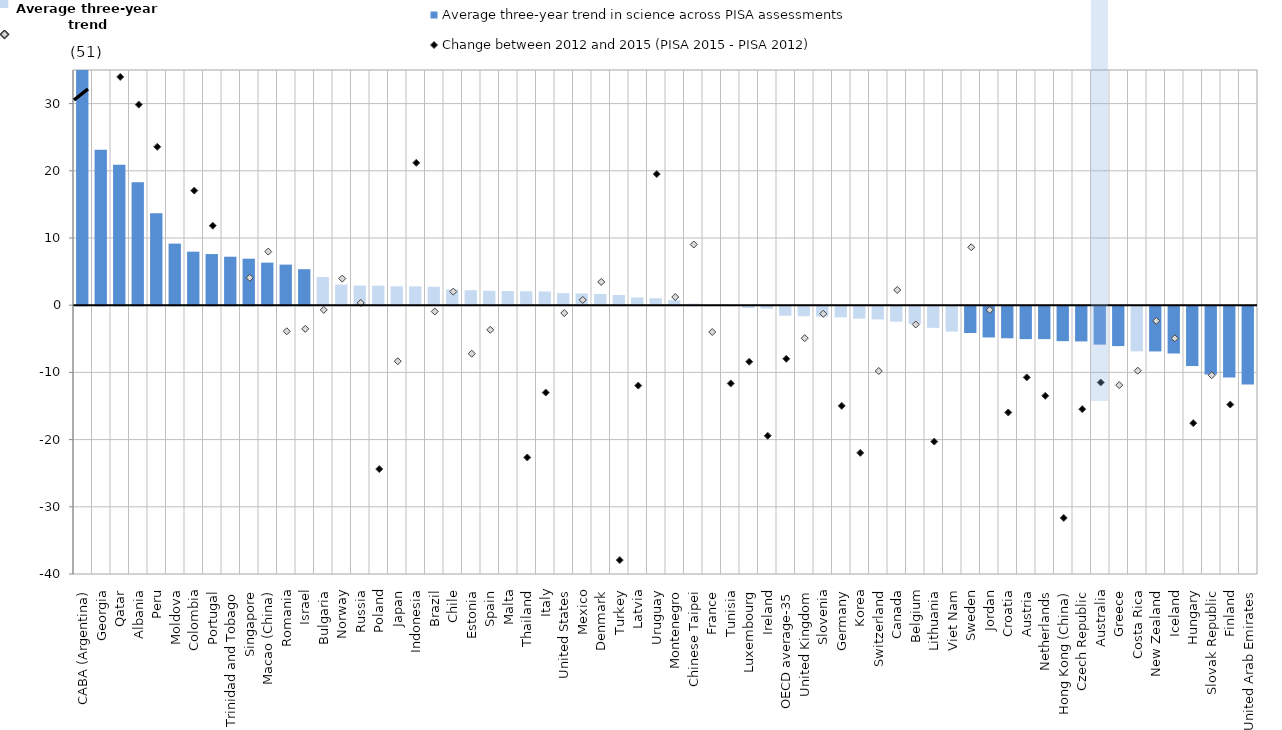
| Category | Average three-year trend in science across PISA assessments | not sign |
|---|---|---|
| CABA (Argentina) | 50.564 | 0 |
| Georgia | 23.117 | 0 |
| Qatar | 20.916 | 0 |
| Albania | 18.297 | 0 |
| Peru | 13.69 | 0 |
| Moldova | 9.167 | 0 |
| Colombia | 7.965 | 0 |
| Portugal | 7.612 | 0 |
| Trinidad and Tobago | 7.215 | 0 |
| Singapore | 6.92 | 0 |
| Macao (China) | 6.336 | 0 |
| Romania | 6.04 | 0 |
| Israel | 5.356 | 0 |
| Bulgaria | 0 | 4.186 |
| Norway | 0 | 3.065 |
| Russia | 0 | 2.923 |
| Poland | 0 | 2.914 |
| Japan | 0 | 2.808 |
| Indonesia | 0 | 2.802 |
| Brazil | 0 | 2.741 |
| Chile | 0 | 2.351 |
| Estonia | 0 | 2.231 |
| Spain | 0 | 2.143 |
| Malta | 0 | 2.105 |
| Thailand | 0 | 2.075 |
| Italy | 0 | 2.043 |
| United States | 0 | 1.799 |
| Mexico | 0 | 1.739 |
| Denmark | 0 | 1.674 |
| Turkey | 0 | 1.522 |
| Latvia | 0 | 1.148 |
| Uruguay | 0 | 1.038 |
| Montenegro | 0 | 0.75 |
| Chinese Taipei | 0 | 0.226 |
| France | 0 | 0.031 |
| Tunisia | 0 | 0.018 |
| Luxembourg | 0 | -0.274 |
| Ireland | 0 | -0.353 |
| OECD average-35 | 0 | -1.423 |
| United Kingdom | 0 | -1.492 |
| Slovenia | 0 | -1.548 |
| Germany | 0 | -1.654 |
| Korea | 0 | -1.86 |
| Switzerland | 0 | -1.968 |
| Canada | 0 | -2.308 |
| Belgium | 0 | -2.651 |
| Lithuania | 0 | -3.224 |
| Viet Nam | 0 | -3.779 |
| Sweden | -3.99 | 0 |
| Jordan | -4.649 | 0 |
| Croatia | -4.771 | 0 |
| Austria | -4.899 | 0 |
| Netherlands | -4.899 | 0 |
| Hong Kong (China) | -5.2 | 0 |
| Czech Republic | -5.244 | 0 |
| Australia | -5.715 | 0 |
| Greece | -5.934 | 0 |
| Costa Rica | 0 | -6.719 |
| New Zealand | -6.73 | 0 |
| Iceland | -7.039 | 0 |
| Hungary | -8.908 | 0 |
| Slovak Republic | -10.176 | 0 |
| Finland | -10.606 | 0 |
| United Arab Emirates | -11.639 | 0 |